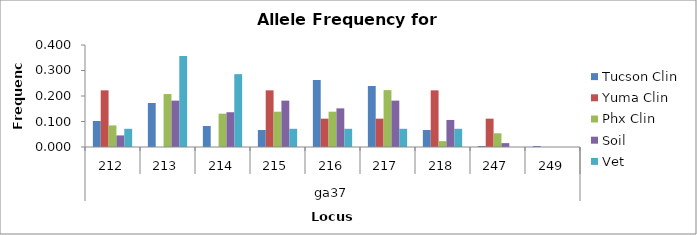
| Category | Tucson Clin | Yuma Clin | Phx Clin | Soil | Vet |
|---|---|---|---|---|---|
| 0 | 0.102 | 0.222 | 0.085 | 0.045 | 0.071 |
| 1 | 0.173 | 0 | 0.208 | 0.182 | 0.357 |
| 2 | 0.082 | 0 | 0.131 | 0.136 | 0.286 |
| 3 | 0.067 | 0.222 | 0.138 | 0.182 | 0.071 |
| 4 | 0.263 | 0.111 | 0.138 | 0.152 | 0.071 |
| 5 | 0.239 | 0.111 | 0.223 | 0.182 | 0.071 |
| 6 | 0.067 | 0.222 | 0.023 | 0.106 | 0.071 |
| 7 | 0.004 | 0.111 | 0.054 | 0.015 | 0 |
| 8 | 0.004 | 0 | 0 | 0 | 0 |